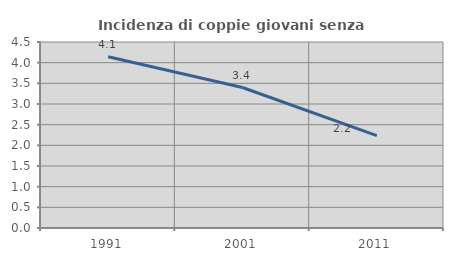
| Category | Incidenza di coppie giovani senza figli |
|---|---|
| 1991.0 | 4.143 |
| 2001.0 | 3.399 |
| 2011.0 | 2.236 |